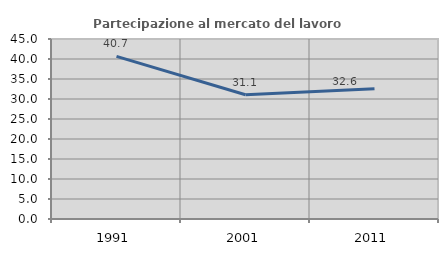
| Category | Partecipazione al mercato del lavoro  femminile |
|---|---|
| 1991.0 | 40.664 |
| 2001.0 | 31.064 |
| 2011.0 | 32.562 |